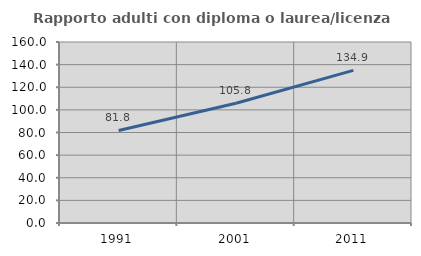
| Category | Rapporto adulti con diploma o laurea/licenza media  |
|---|---|
| 1991.0 | 81.804 |
| 2001.0 | 105.813 |
| 2011.0 | 134.93 |